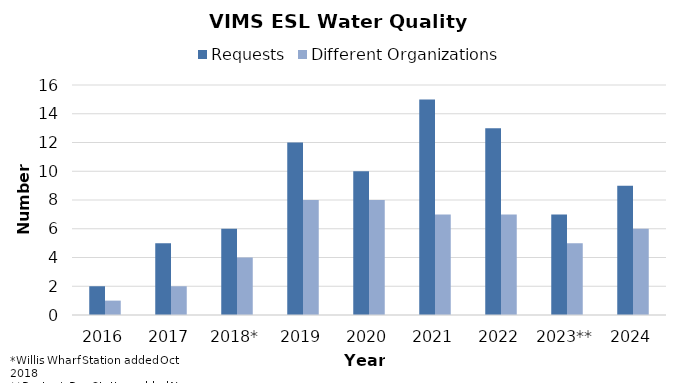
| Category | Requests | Different Organizations |
|---|---|---|
| 2016 | 2 | 1 |
| 2017 | 5 | 2 |
| 2018* | 6 | 4 |
| 2019 | 12 | 8 |
| 2020 | 10 | 8 |
| 2021 | 15 | 7 |
| 2022 | 13 | 7 |
| 2023** | 7 | 5 |
| 2024 | 9 | 6 |